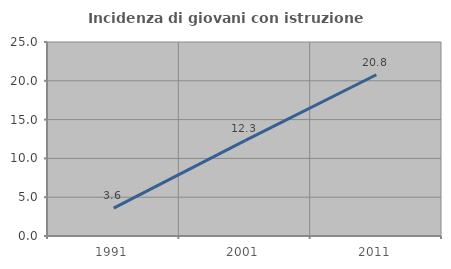
| Category | Incidenza di giovani con istruzione universitaria |
|---|---|
| 1991.0 | 3.601 |
| 2001.0 | 12.293 |
| 2011.0 | 20.779 |